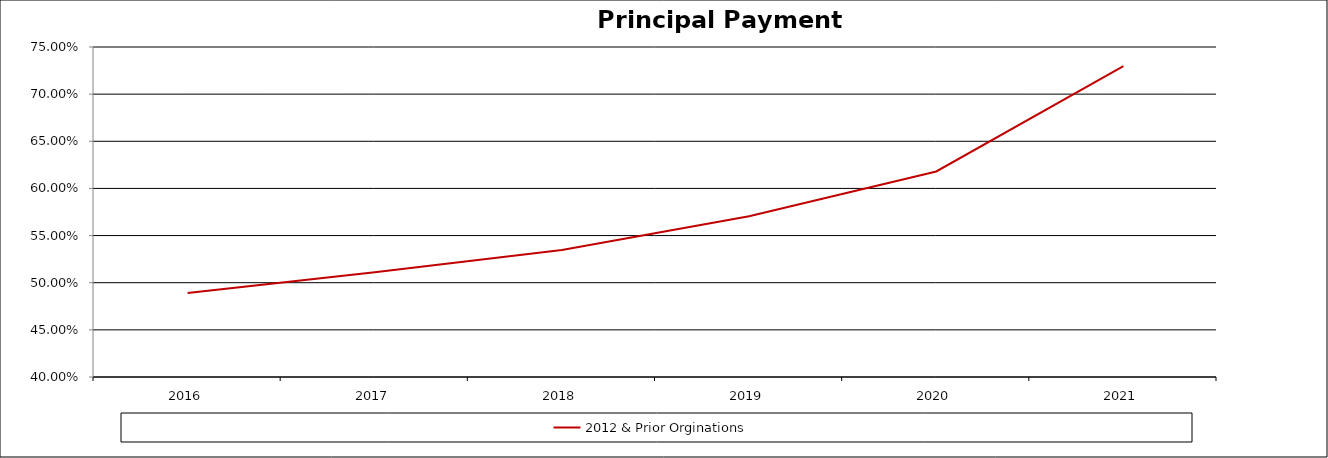
| Category | 2012 & Prior Orginations  |
|---|---|
| 2016.0 | 0.489 |
| 2017.0 | 0.511 |
| 2018.0 | 0.535 |
| 2019.0 | 0.57 |
| 2020.0 | 0.618 |
| 2021.0 | 0.73 |